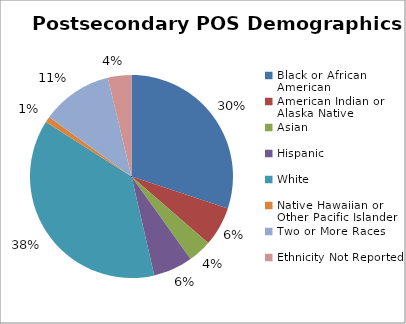
| Category | Series 0 |
|---|---|
| Black or African American | 0.301 |
| American Indian or Alaska Native | 0.063 |
| Asian | 0.038 |
| Hispanic | 0.063 |
| White | 0.376 |
| Native Hawaiian or Other Pacific Islander | 0.009 |
| Two or More Races | 0.113 |
| Ethnicity Not Reported | 0.038 |